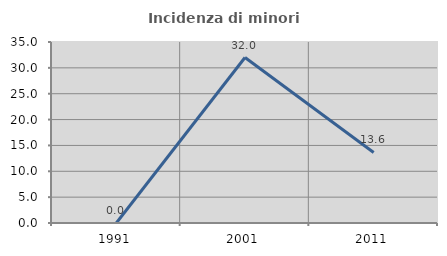
| Category | Incidenza di minori stranieri |
|---|---|
| 1991.0 | 0 |
| 2001.0 | 32 |
| 2011.0 | 13.636 |